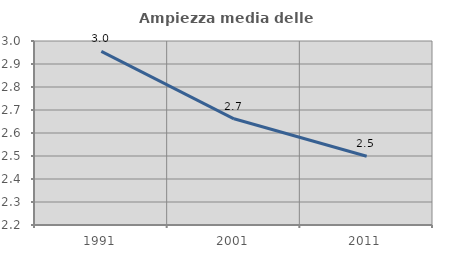
| Category | Ampiezza media delle famiglie |
|---|---|
| 1991.0 | 2.955 |
| 2001.0 | 2.662 |
| 2011.0 | 2.499 |